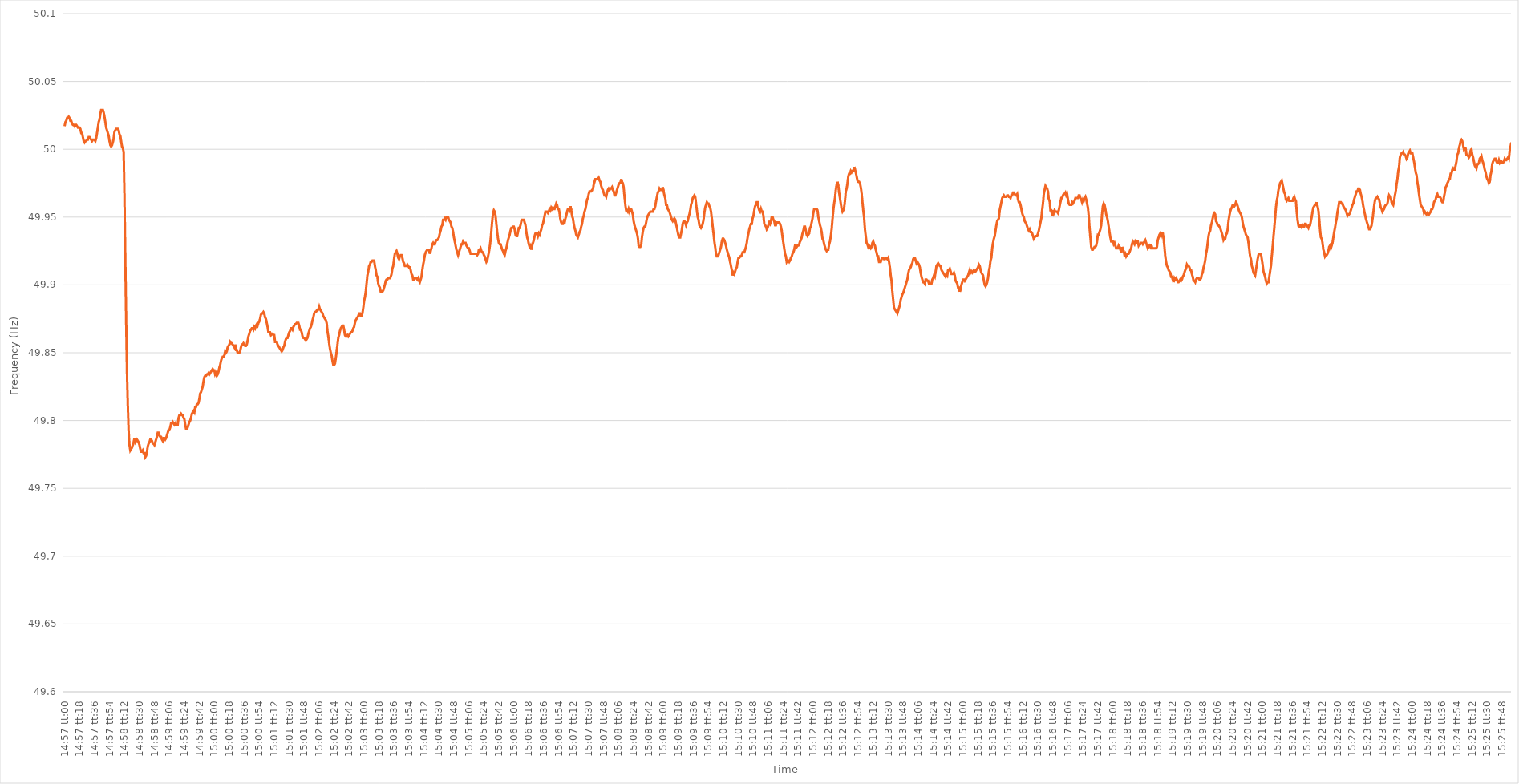
| Category | Series 0 |
|---|---|
| 0.6229166666666667 | 50.017 |
| 0.6229282407407407 | 50.02 |
| 0.6229398148148148 | 50.021 |
| 0.6229513888888889 | 50.023 |
| 0.6229629629629629 | 50.023 |
| 0.6229745370370371 | 50.024 |
| 0.6229861111111111 | 50.023 |
| 0.6229976851851852 | 50.021 |
| 0.6230092592592592 | 50.021 |
| 0.6230208333333334 | 50.019 |
| 0.6230324074074074 | 50.018 |
| 0.6230439814814815 | 50.018 |
| 0.6230555555555556 | 50.017 |
| 0.6230671296296296 | 50.018 |
| 0.6230787037037037 | 50.018 |
| 0.6230902777777778 | 50.017 |
| 0.6231018518518519 | 50.016 |
| 0.6231134259259259 | 50.016 |
| 0.623125 | 50.016 |
| 0.6231365740740741 | 50.015 |
| 0.6231481481481481 | 50.012 |
| 0.6231597222222222 | 50.012 |
| 0.6231712962962963 | 50.009 |
| 0.6231828703703703 | 50.006 |
| 0.6231944444444445 | 50.005 |
| 0.6232060185185185 | 50.006 |
| 0.6232175925925926 | 50.006 |
| 0.6232291666666666 | 50.007 |
| 0.6232407407407408 | 50.007 |
| 0.6232523148148148 | 50.009 |
| 0.623263888888889 | 50.009 |
| 0.623275462962963 | 50.008 |
| 0.623287037037037 | 50.007 |
| 0.6232986111111111 | 50.006 |
| 0.6233101851851852 | 50.007 |
| 0.6233217592592593 | 50.007 |
| 0.6233333333333334 | 50.007 |
| 0.6233449074074074 | 50.006 |
| 0.6233564814814815 | 50.008 |
| 0.6233680555555555 | 50.012 |
| 0.6233796296296296 | 50.016 |
| 0.6233912037037037 | 50.02 |
| 0.6234027777777778 | 50.022 |
| 0.6234143518518519 | 50.026 |
| 0.6234259259259259 | 50.029 |
| 0.6234375 | 50.029 |
| 0.623449074074074 | 50.029 |
| 0.6234606481481482 | 50.027 |
| 0.6234722222222222 | 50.024 |
| 0.6234837962962964 | 50.02 |
| 0.6234953703703704 | 50.016 |
| 0.6235069444444444 | 50.014 |
| 0.6235185185185185 | 50.012 |
| 0.6235300925925926 | 50.01 |
| 0.6235416666666667 | 50.006 |
| 0.6235532407407408 | 50.003 |
| 0.6235648148148148 | 50.002 |
| 0.6235763888888889 | 50.003 |
| 0.6235879629629629 | 50.005 |
| 0.623599537037037 | 50.008 |
| 0.6236111111111111 | 50.013 |
| 0.6236226851851852 | 50.014 |
| 0.6236342592592593 | 50.015 |
| 0.6236458333333333 | 50.015 |
| 0.6236574074074074 | 50.015 |
| 0.6236689814814814 | 50.014 |
| 0.6236805555555556 | 50.011 |
| 0.6236921296296296 | 50.01 |
| 0.6237037037037038 | 50.006 |
| 0.6237152777777778 | 50.002 |
| 0.6237268518518518 | 50.001 |
| 0.6237384259259259 | 49.998 |
| 0.62375 | 49.965 |
| 0.6237615740740741 | 49.919 |
| 0.6237731481481482 | 49.874 |
| 0.6237847222222223 | 49.836 |
| 0.6237962962962963 | 49.811 |
| 0.6238078703703703 | 49.792 |
| 0.6238194444444444 | 49.782 |
| 0.6238310185185185 | 49.778 |
| 0.6238425925925926 | 49.779 |
| 0.6238541666666667 | 49.78 |
| 0.6238657407407407 | 49.782 |
| 0.6238773148148148 | 49.784 |
| 0.6238888888888888 | 49.787 |
| 0.623900462962963 | 49.784 |
| 0.623912037037037 | 49.785 |
| 0.6239236111111112 | 49.786 |
| 0.6239351851851852 | 49.785 |
| 0.6239467592592592 | 49.784 |
| 0.6239583333333333 | 49.782 |
| 0.6239699074074074 | 49.779 |
| 0.6239814814814815 | 49.777 |
| 0.6239930555555556 | 49.777 |
| 0.6240046296296297 | 49.778 |
| 0.6240162037037037 | 49.776 |
| 0.6240277777777777 | 49.776 |
| 0.6240393518518519 | 49.773 |
| 0.6240509259259259 | 49.774 |
| 0.6240625 | 49.777 |
| 0.6240740740740741 | 49.781 |
| 0.6240856481481482 | 49.783 |
| 0.6240972222222222 | 49.784 |
| 0.6241087962962962 | 49.786 |
| 0.6241203703703704 | 49.786 |
| 0.6241319444444444 | 49.785 |
| 0.6241435185185186 | 49.783 |
| 0.6241550925925926 | 49.783 |
| 0.6241666666666666 | 49.782 |
| 0.6241782407407407 | 49.784 |
| 0.6241898148148148 | 49.786 |
| 0.6242013888888889 | 49.788 |
| 0.624212962962963 | 49.791 |
| 0.6242245370370371 | 49.791 |
| 0.6242361111111111 | 49.789 |
| 0.6242476851851851 | 49.788 |
| 0.6242592592592593 | 49.788 |
| 0.6242708333333333 | 49.786 |
| 0.6242824074074075 | 49.785 |
| 0.6242939814814815 | 49.787 |
| 0.6243055555555556 | 49.787 |
| 0.6243171296296296 | 49.786 |
| 0.6243287037037036 | 49.787 |
| 0.6243402777777778 | 49.789 |
| 0.6243518518518518 | 49.791 |
| 0.624363425925926 | 49.793 |
| 0.624375 | 49.793 |
| 0.624386574074074 | 49.795 |
| 0.6243981481481481 | 49.798 |
| 0.6244097222222222 | 49.798 |
| 0.6244212962962963 | 49.799 |
| 0.6244328703703704 | 49.798 |
| 0.6244444444444445 | 49.797 |
| 0.6244560185185185 | 49.798 |
| 0.6244675925925925 | 49.797 |
| 0.6244791666666667 | 49.797 |
| 0.6244907407407407 | 49.797 |
| 0.6245023148148149 | 49.802 |
| 0.6245138888888889 | 49.804 |
| 0.624525462962963 | 49.804 |
| 0.624537037037037 | 49.805 |
| 0.624548611111111 | 49.804 |
| 0.6245601851851852 | 49.804 |
| 0.6245717592592592 | 49.802 |
| 0.6245833333333334 | 49.801 |
| 0.6245949074074074 | 49.797 |
| 0.6246064814814815 | 49.794 |
| 0.6246180555555555 | 49.794 |
| 0.6246296296296296 | 49.795 |
| 0.6246412037037037 | 49.797 |
| 0.6246527777777778 | 49.799 |
| 0.6246643518518519 | 49.8 |
| 0.6246759259259259 | 49.802 |
| 0.6246875 | 49.805 |
| 0.6246990740740741 | 49.806 |
| 0.6247106481481481 | 49.807 |
| 0.6247222222222223 | 49.806 |
| 0.6247337962962963 | 49.81 |
| 0.6247453703703704 | 49.81 |
| 0.6247569444444444 | 49.812 |
| 0.6247685185185184 | 49.812 |
| 0.6247800925925926 | 49.813 |
| 0.6247916666666666 | 49.816 |
| 0.6248032407407408 | 49.82 |
| 0.6248148148148148 | 49.821 |
| 0.6248263888888889 | 49.823 |
| 0.6248379629629629 | 49.825 |
| 0.624849537037037 | 49.829 |
| 0.6248611111111111 | 49.832 |
| 0.6248726851851852 | 49.833 |
| 0.6248842592592593 | 49.833 |
| 0.6248958333333333 | 49.834 |
| 0.6249074074074074 | 49.834 |
| 0.6249189814814815 | 49.835 |
| 0.6249305555555555 | 49.834 |
| 0.6249421296296297 | 49.835 |
| 0.6249537037037037 | 49.836 |
| 0.6249652777777778 | 49.837 |
| 0.6249768518518518 | 49.838 |
| 0.624988425925926 | 49.837 |
| 0.625 | 49.837 |
| 0.625011574074074 | 49.834 |
| 0.6250231481481482 | 49.835 |
| 0.6250347222222222 | 49.833 |
| 0.6250462962962963 | 49.834 |
| 0.6250578703703703 | 49.836 |
| 0.6250694444444445 | 49.839 |
| 0.6250810185185185 | 49.841 |
| 0.6250925925925926 | 49.844 |
| 0.6251041666666667 | 49.846 |
| 0.6251157407407407 | 49.847 |
| 0.6251273148148148 | 49.847 |
| 0.6251388888888889 | 49.848 |
| 0.625150462962963 | 49.851 |
| 0.6251620370370371 | 49.85 |
| 0.6251736111111111 | 49.851 |
| 0.6251851851851852 | 49.854 |
| 0.6251967592592592 | 49.855 |
| 0.6252083333333334 | 49.856 |
| 0.6252199074074074 | 49.858 |
| 0.6252314814814816 | 49.857 |
| 0.6252430555555556 | 49.857 |
| 0.6252546296296296 | 49.856 |
| 0.6252662037037037 | 49.855 |
| 0.6252777777777777 | 49.854 |
| 0.6252893518518519 | 49.856 |
| 0.6253009259259259 | 49.852 |
| 0.6253125 | 49.852 |
| 0.6253240740740741 | 49.85 |
| 0.6253356481481481 | 49.85 |
| 0.6253472222222222 | 49.85 |
| 0.6253587962962963 | 49.851 |
| 0.6253703703703704 | 49.854 |
| 0.6253819444444445 | 49.856 |
| 0.6253935185185185 | 49.856 |
| 0.6254050925925926 | 49.857 |
| 0.6254166666666666 | 49.856 |
| 0.6254282407407408 | 49.855 |
| 0.6254398148148148 | 49.855 |
| 0.625451388888889 | 49.856 |
| 0.625462962962963 | 49.859 |
| 0.625474537037037 | 49.862 |
| 0.6254861111111111 | 49.864 |
| 0.6254976851851851 | 49.866 |
| 0.6255092592592593 | 49.867 |
| 0.6255208333333333 | 49.868 |
| 0.6255324074074075 | 49.868 |
| 0.6255439814814815 | 49.867 |
| 0.6255555555555555 | 49.869 |
| 0.6255671296296296 | 49.868 |
| 0.6255787037037037 | 49.87 |
| 0.6255902777777778 | 49.871 |
| 0.6256018518518519 | 49.87 |
| 0.625613425925926 | 49.872 |
| 0.625625 | 49.873 |
| 0.625636574074074 | 49.875 |
| 0.6256481481481482 | 49.878 |
| 0.6256597222222222 | 49.879 |
| 0.6256712962962964 | 49.879 |
| 0.6256828703703704 | 49.88 |
| 0.6256944444444444 | 49.879 |
| 0.6257060185185185 | 49.876 |
| 0.6257175925925925 | 49.875 |
| 0.6257291666666667 | 49.872 |
| 0.6257407407407407 | 49.869 |
| 0.6257523148148149 | 49.865 |
| 0.6257638888888889 | 49.865 |
| 0.6257754629629629 | 49.865 |
| 0.625787037037037 | 49.863 |
| 0.6257986111111111 | 49.864 |
| 0.6258101851851852 | 49.864 |
| 0.6258217592592593 | 49.863 |
| 0.6258333333333334 | 49.863 |
| 0.6258449074074074 | 49.858 |
| 0.6258564814814814 | 49.858 |
| 0.6258680555555556 | 49.858 |
| 0.6258796296296296 | 49.856 |
| 0.6258912037037038 | 49.855 |
| 0.6259027777777778 | 49.854 |
| 0.6259143518518518 | 49.853 |
| 0.6259259259259259 | 49.852 |
| 0.6259375 | 49.851 |
| 0.6259490740740741 | 49.852 |
| 0.6259606481481481 | 49.854 |
| 0.6259722222222223 | 49.855 |
| 0.6259837962962963 | 49.858 |
| 0.6259953703703703 | 49.86 |
| 0.6260069444444444 | 49.861 |
| 0.6260185185185185 | 49.861 |
| 0.6260300925925926 | 49.863 |
| 0.6260416666666667 | 49.865 |
| 0.6260532407407408 | 49.866 |
| 0.6260648148148148 | 49.868 |
| 0.6260763888888888 | 49.868 |
| 0.626087962962963 | 49.867 |
| 0.626099537037037 | 49.869 |
| 0.6261111111111112 | 49.87 |
| 0.6261226851851852 | 49.871 |
| 0.6261342592592593 | 49.871 |
| 0.6261458333333333 | 49.872 |
| 0.6261574074074074 | 49.872 |
| 0.6261689814814815 | 49.872 |
| 0.6261805555555556 | 49.87 |
| 0.6261921296296297 | 49.867 |
| 0.6262037037037037 | 49.867 |
| 0.6262152777777777 | 49.865 |
| 0.6262268518518518 | 49.862 |
| 0.6262384259259259 | 49.861 |
| 0.62625 | 49.861 |
| 0.6262615740740741 | 49.86 |
| 0.6262731481481482 | 49.859 |
| 0.6262847222222222 | 49.86 |
| 0.6262962962962962 | 49.861 |
| 0.6263078703703704 | 49.864 |
| 0.6263194444444444 | 49.866 |
| 0.6263310185185186 | 49.868 |
| 0.6263425925925926 | 49.869 |
| 0.6263541666666667 | 49.871 |
| 0.6263657407407407 | 49.874 |
| 0.6263773148148148 | 49.876 |
| 0.6263888888888889 | 49.879 |
| 0.626400462962963 | 49.88 |
| 0.6264120370370371 | 49.88 |
| 0.6264236111111111 | 49.881 |
| 0.6264351851851852 | 49.881 |
| 0.6264467592592592 | 49.882 |
| 0.6264583333333333 | 49.884 |
| 0.6264699074074074 | 49.882 |
| 0.6264814814814815 | 49.881 |
| 0.6264930555555556 | 49.88 |
| 0.6265046296296296 | 49.879 |
| 0.6265162037037036 | 49.877 |
| 0.6265277777777778 | 49.876 |
| 0.6265393518518518 | 49.875 |
| 0.626550925925926 | 49.874 |
| 0.6265625 | 49.872 |
| 0.6265740740740741 | 49.866 |
| 0.6265856481481481 | 49.862 |
| 0.6265972222222222 | 49.857 |
| 0.6266087962962963 | 49.853 |
| 0.6266203703703704 | 49.85 |
| 0.6266319444444445 | 49.848 |
| 0.6266435185185185 | 49.844 |
| 0.6266550925925926 | 49.841 |
| 0.6266666666666666 | 49.841 |
| 0.6266782407407407 | 49.842 |
| 0.6266898148148148 | 49.846 |
| 0.6267013888888889 | 49.851 |
| 0.626712962962963 | 49.856 |
| 0.626724537037037 | 49.861 |
| 0.626736111111111 | 49.863 |
| 0.6267476851851852 | 49.866 |
| 0.6267592592592592 | 49.868 |
| 0.6267708333333334 | 49.869 |
| 0.6267824074074074 | 49.87 |
| 0.6267939814814815 | 49.87 |
| 0.6268055555555555 | 49.867 |
| 0.6268171296296297 | 49.863 |
| 0.6268287037037037 | 49.862 |
| 0.6268402777777778 | 49.862 |
| 0.6268518518518519 | 49.863 |
| 0.6268634259259259 | 49.862 |
| 0.626875 | 49.863 |
| 0.6268865740740741 | 49.864 |
| 0.6268981481481481 | 49.865 |
| 0.6269097222222222 | 49.865 |
| 0.6269212962962963 | 49.866 |
| 0.6269328703703704 | 49.868 |
| 0.6269444444444444 | 49.869 |
| 0.6269560185185185 | 49.872 |
| 0.6269675925925926 | 49.874 |
| 0.6269791666666666 | 49.875 |
| 0.6269907407407408 | 49.876 |
| 0.6270023148148148 | 49.877 |
| 0.6270138888888889 | 49.879 |
| 0.6270254629629629 | 49.879 |
| 0.6270370370370371 | 49.877 |
| 0.6270486111111111 | 49.877 |
| 0.6270601851851852 | 49.879 |
| 0.6270717592592593 | 49.883 |
| 0.6270833333333333 | 49.888 |
| 0.6270949074074074 | 49.891 |
| 0.6271064814814815 | 49.895 |
| 0.6271180555555556 | 49.901 |
| 0.6271296296296297 | 49.907 |
| 0.6271412037037037 | 49.91 |
| 0.6271527777777778 | 49.914 |
| 0.6271643518518518 | 49.915 |
| 0.6271759259259259 | 49.917 |
| 0.6271875 | 49.917 |
| 0.627199074074074 | 49.918 |
| 0.6272106481481482 | 49.918 |
| 0.6272222222222222 | 49.918 |
| 0.6272337962962963 | 49.914 |
| 0.6272453703703703 | 49.911 |
| 0.6272569444444445 | 49.907 |
| 0.6272685185185185 | 49.906 |
| 0.6272800925925927 | 49.901 |
| 0.6272916666666667 | 49.899 |
| 0.6273032407407407 | 49.898 |
| 0.6273148148148148 | 49.895 |
| 0.6273263888888889 | 49.895 |
| 0.627337962962963 | 49.895 |
| 0.6273495370370371 | 49.896 |
| 0.6273611111111111 | 49.898 |
| 0.6273726851851852 | 49.9 |
| 0.6273842592592592 | 49.903 |
| 0.6273958333333333 | 49.904 |
| 0.6274074074074074 | 49.904 |
| 0.6274189814814815 | 49.905 |
| 0.6274305555555556 | 49.905 |
| 0.6274421296296296 | 49.905 |
| 0.6274537037037037 | 49.906 |
| 0.6274652777777777 | 49.908 |
| 0.6274768518518519 | 49.912 |
| 0.6274884259259259 | 49.914 |
| 0.6275000000000001 | 49.919 |
| 0.6275115740740741 | 49.923 |
| 0.6275231481481481 | 49.924 |
| 0.6275347222222222 | 49.925 |
| 0.6275462962962963 | 49.923 |
| 0.6275578703703704 | 49.92 |
| 0.6275694444444445 | 49.919 |
| 0.6275810185185186 | 49.921 |
| 0.6275925925925926 | 49.922 |
| 0.6276041666666666 | 49.922 |
| 0.6276157407407407 | 49.92 |
| 0.6276273148148148 | 49.917 |
| 0.6276388888888889 | 49.916 |
| 0.627650462962963 | 49.914 |
| 0.627662037037037 | 49.914 |
| 0.6276736111111111 | 49.914 |
| 0.6276851851851851 | 49.915 |
| 0.6276967592592593 | 49.914 |
| 0.6277083333333333 | 49.913 |
| 0.6277199074074075 | 49.913 |
| 0.6277314814814815 | 49.911 |
| 0.6277430555555555 | 49.908 |
| 0.6277546296296296 | 49.907 |
| 0.6277662037037037 | 49.904 |
| 0.6277777777777778 | 49.904 |
| 0.6277893518518519 | 49.905 |
| 0.627800925925926 | 49.905 |
| 0.6278125 | 49.905 |
| 0.627824074074074 | 49.904 |
| 0.6278356481481482 | 49.905 |
| 0.6278472222222222 | 49.903 |
| 0.6278587962962963 | 49.902 |
| 0.6278703703703704 | 49.904 |
| 0.6278819444444445 | 49.906 |
| 0.6278935185185185 | 49.911 |
| 0.6279050925925925 | 49.915 |
| 0.6279166666666667 | 49.918 |
| 0.6279282407407407 | 49.922 |
| 0.6279398148148149 | 49.924 |
| 0.6279513888888889 | 49.925 |
| 0.627962962962963 | 49.926 |
| 0.627974537037037 | 49.926 |
| 0.6279861111111111 | 49.926 |
| 0.6279976851851852 | 49.923 |
| 0.6280092592592593 | 49.925 |
| 0.6280208333333334 | 49.927 |
| 0.6280324074074074 | 49.93 |
| 0.6280439814814814 | 49.931 |
| 0.6280555555555556 | 49.93 |
| 0.6280671296296296 | 49.93 |
| 0.6280787037037037 | 49.932 |
| 0.6280902777777778 | 49.933 |
| 0.6281018518518519 | 49.933 |
| 0.6281134259259259 | 49.934 |
| 0.6281249999999999 | 49.935 |
| 0.6281365740740741 | 49.938 |
| 0.6281481481481481 | 49.94 |
| 0.6281597222222223 | 49.943 |
| 0.6281712962962963 | 49.944 |
| 0.6281828703703703 | 49.948 |
| 0.6281944444444444 | 49.948 |
| 0.6282060185185185 | 49.949 |
| 0.6282175925925926 | 49.948 |
| 0.6282291666666667 | 49.95 |
| 0.6282407407407408 | 49.95 |
| 0.6282523148148148 | 49.95 |
| 0.6282638888888888 | 49.948 |
| 0.628275462962963 | 49.947 |
| 0.628287037037037 | 49.946 |
| 0.6282986111111112 | 49.943 |
| 0.6283101851851852 | 49.942 |
| 0.6283217592592593 | 49.939 |
| 0.6283333333333333 | 49.935 |
| 0.6283449074074073 | 49.932 |
| 0.6283564814814815 | 49.929 |
| 0.6283680555555555 | 49.926 |
| 0.6283796296296297 | 49.924 |
| 0.6283912037037037 | 49.922 |
| 0.6284027777777778 | 49.924 |
| 0.6284143518518518 | 49.926 |
| 0.6284259259259259 | 49.928 |
| 0.6284375 | 49.93 |
| 0.6284490740740741 | 49.93 |
| 0.6284606481481482 | 49.932 |
| 0.6284722222222222 | 49.931 |
| 0.6284837962962962 | 49.931 |
| 0.6284953703703704 | 49.931 |
| 0.6285069444444444 | 49.929 |
| 0.6285185185185186 | 49.928 |
| 0.6285300925925926 | 49.927 |
| 0.6285416666666667 | 49.927 |
| 0.6285532407407407 | 49.925 |
| 0.6285648148148147 | 49.923 |
| 0.6285763888888889 | 49.923 |
| 0.6285879629629629 | 49.923 |
| 0.6285995370370371 | 49.923 |
| 0.6286111111111111 | 49.923 |
| 0.6286226851851852 | 49.923 |
| 0.6286342592592592 | 49.923 |
| 0.6286458333333333 | 49.923 |
| 0.6286574074074074 | 49.922 |
| 0.6286689814814815 | 49.923 |
| 0.6286805555555556 | 49.926 |
| 0.6286921296296296 | 49.926 |
| 0.6287037037037037 | 49.927 |
| 0.6287152777777778 | 49.925 |
| 0.6287268518518518 | 49.924 |
| 0.628738425925926 | 49.924 |
| 0.62875 | 49.922 |
| 0.6287615740740741 | 49.921 |
| 0.6287731481481481 | 49.919 |
| 0.6287847222222223 | 49.917 |
| 0.6287962962962963 | 49.918 |
| 0.6288078703703703 | 49.921 |
| 0.6288194444444445 | 49.924 |
| 0.6288310185185185 | 49.928 |
| 0.6288425925925926 | 49.933 |
| 0.6288541666666666 | 49.94 |
| 0.6288657407407408 | 49.947 |
| 0.6288773148148148 | 49.953 |
| 0.6288888888888889 | 49.955 |
| 0.628900462962963 | 49.954 |
| 0.628912037037037 | 49.951 |
| 0.6289236111111111 | 49.945 |
| 0.6289351851851852 | 49.939 |
| 0.6289467592592592 | 49.934 |
| 0.6289583333333334 | 49.931 |
| 0.6289699074074074 | 49.93 |
| 0.6289814814814815 | 49.93 |
| 0.6289930555555555 | 49.928 |
| 0.6290046296296297 | 49.926 |
| 0.6290162037037037 | 49.925 |
| 0.6290277777777777 | 49.923 |
| 0.6290393518518519 | 49.922 |
| 0.6290509259259259 | 49.925 |
| 0.6290625 | 49.927 |
| 0.629074074074074 | 49.93 |
| 0.6290856481481482 | 49.933 |
| 0.6290972222222222 | 49.935 |
| 0.6291087962962963 | 49.937 |
| 0.6291203703703704 | 49.94 |
| 0.6291319444444444 | 49.942 |
| 0.6291435185185185 | 49.942 |
| 0.6291550925925926 | 49.943 |
| 0.6291666666666667 | 49.943 |
| 0.6291782407407408 | 49.941 |
| 0.6291898148148148 | 49.937 |
| 0.6292013888888889 | 49.936 |
| 0.6292129629629629 | 49.936 |
| 0.6292245370370371 | 49.939 |
| 0.6292361111111111 | 49.942 |
| 0.6292476851851853 | 49.942 |
| 0.6292592592592593 | 49.944 |
| 0.6292708333333333 | 49.947 |
| 0.6292824074074074 | 49.948 |
| 0.6292939814814814 | 49.948 |
| 0.6293055555555556 | 49.948 |
| 0.6293171296296296 | 49.946 |
| 0.6293287037037038 | 49.944 |
| 0.6293402777777778 | 49.939 |
| 0.6293518518518518 | 49.935 |
| 0.6293634259259259 | 49.933 |
| 0.629375 | 49.93 |
| 0.6293865740740741 | 49.928 |
| 0.6293981481481482 | 49.929 |
| 0.6294097222222222 | 49.926 |
| 0.6294212962962963 | 49.929 |
| 0.6294328703703703 | 49.931 |
| 0.6294444444444445 | 49.933 |
| 0.6294560185185185 | 49.936 |
| 0.6294675925925927 | 49.938 |
| 0.6294791666666667 | 49.938 |
| 0.6294907407407407 | 49.938 |
| 0.6295023148148148 | 49.936 |
| 0.6295138888888888 | 49.938 |
| 0.629525462962963 | 49.937 |
| 0.629537037037037 | 49.939 |
| 0.6295486111111112 | 49.941 |
| 0.6295601851851852 | 49.944 |
| 0.6295717592592592 | 49.945 |
| 0.6295833333333333 | 49.948 |
| 0.6295949074074074 | 49.951 |
| 0.6296064814814815 | 49.954 |
| 0.6296180555555556 | 49.954 |
| 0.6296296296296297 | 49.954 |
| 0.6296412037037037 | 49.953 |
| 0.6296527777777777 | 49.954 |
| 0.6296643518518519 | 49.956 |
| 0.6296759259259259 | 49.955 |
| 0.6296875000000001 | 49.957 |
| 0.6296990740740741 | 49.956 |
| 0.6297106481481481 | 49.957 |
| 0.6297222222222222 | 49.956 |
| 0.6297337962962963 | 49.956 |
| 0.6297453703703704 | 49.958 |
| 0.6297569444444444 | 49.96 |
| 0.6297685185185186 | 49.959 |
| 0.6297800925925926 | 49.956 |
| 0.6297916666666666 | 49.956 |
| 0.6298032407407407 | 49.953 |
| 0.6298148148148148 | 49.948 |
| 0.6298263888888889 | 49.946 |
| 0.629837962962963 | 49.945 |
| 0.629849537037037 | 49.945 |
| 0.6298611111111111 | 49.947 |
| 0.6298726851851851 | 49.946 |
| 0.6298842592592593 | 49.949 |
| 0.6298958333333333 | 49.951 |
| 0.6299074074074075 | 49.954 |
| 0.6299189814814815 | 49.956 |
| 0.6299305555555555 | 49.956 |
| 0.6299421296296296 | 49.955 |
| 0.6299537037037037 | 49.958 |
| 0.6299652777777778 | 49.955 |
| 0.6299768518518518 | 49.951 |
| 0.629988425925926 | 49.949 |
| 0.63 | 49.945 |
| 0.630011574074074 | 49.942 |
| 0.6300231481481481 | 49.94 |
| 0.6300347222222222 | 49.937 |
| 0.6300462962962963 | 49.936 |
| 0.6300578703703704 | 49.935 |
| 0.6300694444444445 | 49.937 |
| 0.6300810185185185 | 49.939 |
| 0.6300925925925925 | 49.94 |
| 0.6301041666666667 | 49.943 |
| 0.6301157407407407 | 49.945 |
| 0.6301273148148149 | 49.949 |
| 0.6301388888888889 | 49.951 |
| 0.630150462962963 | 49.954 |
| 0.630162037037037 | 49.956 |
| 0.6301736111111111 | 49.959 |
| 0.6301851851851852 | 49.963 |
| 0.6301967592592593 | 49.964 |
| 0.6302083333333334 | 49.967 |
| 0.6302199074074074 | 49.969 |
| 0.6302314814814814 | 49.969 |
| 0.6302430555555555 | 49.969 |
| 0.6302546296296296 | 49.97 |
| 0.6302662037037037 | 49.97 |
| 0.6302777777777778 | 49.974 |
| 0.6302893518518519 | 49.976 |
| 0.6303009259259259 | 49.978 |
| 0.6303124999999999 | 49.978 |
| 0.6303240740740741 | 49.978 |
| 0.6303356481481481 | 49.978 |
| 0.6303472222222223 | 49.979 |
| 0.6303587962962963 | 49.977 |
| 0.6303703703703704 | 49.976 |
| 0.6303819444444444 | 49.973 |
| 0.6303935185185185 | 49.971 |
| 0.6304050925925926 | 49.97 |
| 0.6304166666666667 | 49.968 |
| 0.6304282407407408 | 49.966 |
| 0.6304398148148148 | 49.966 |
| 0.6304513888888889 | 49.965 |
| 0.6304629629629629 | 49.968 |
| 0.630474537037037 | 49.97 |
| 0.6304861111111111 | 49.971 |
| 0.6304976851851852 | 49.97 |
| 0.6305092592592593 | 49.971 |
| 0.6305208333333333 | 49.971 |
| 0.6305324074074073 | 49.972 |
| 0.6305439814814815 | 49.97 |
| 0.6305555555555555 | 49.969 |
| 0.6305671296296297 | 49.966 |
| 0.6305787037037037 | 49.966 |
| 0.6305902777777778 | 49.968 |
| 0.6306018518518518 | 49.97 |
| 0.630613425925926 | 49.972 |
| 0.630625 | 49.974 |
| 0.6306365740740741 | 49.975 |
| 0.6306481481481482 | 49.975 |
| 0.6306597222222222 | 49.978 |
| 0.6306712962962963 | 49.976 |
| 0.6306828703703703 | 49.975 |
| 0.6306944444444444 | 49.972 |
| 0.6307060185185185 | 49.965 |
| 0.6307175925925926 | 49.959 |
| 0.6307291666666667 | 49.955 |
| 0.6307407407407407 | 49.955 |
| 0.6307523148148148 | 49.954 |
| 0.6307638888888889 | 49.956 |
| 0.6307754629629629 | 49.954 |
| 0.6307870370370371 | 49.956 |
| 0.6307986111111111 | 49.956 |
| 0.6308101851851852 | 49.954 |
| 0.6308217592592592 | 49.952 |
| 0.6308333333333334 | 49.947 |
| 0.6308449074074074 | 49.944 |
| 0.6308564814814815 | 49.942 |
| 0.6308680555555556 | 49.94 |
| 0.6308796296296296 | 49.938 |
| 0.6308912037037037 | 49.935 |
| 0.6309027777777778 | 49.929 |
| 0.6309143518518519 | 49.928 |
| 0.6309259259259259 | 49.928 |
| 0.6309375 | 49.929 |
| 0.6309490740740741 | 49.935 |
| 0.6309606481481481 | 49.939 |
| 0.6309722222222222 | 49.942 |
| 0.6309837962962963 | 49.943 |
| 0.6309953703703703 | 49.943 |
| 0.6310069444444445 | 49.946 |
| 0.6310185185185185 | 49.949 |
| 0.6310300925925926 | 49.951 |
| 0.6310416666666666 | 49.952 |
| 0.6310532407407408 | 49.953 |
| 0.6310648148148148 | 49.954 |
| 0.631076388888889 | 49.954 |
| 0.631087962962963 | 49.954 |
| 0.631099537037037 | 49.954 |
| 0.6311111111111111 | 49.956 |
| 0.6311226851851852 | 49.956 |
| 0.6311342592592593 | 49.958 |
| 0.6311458333333334 | 49.962 |
| 0.6311574074074074 | 49.965 |
| 0.6311689814814815 | 49.968 |
| 0.6311805555555555 | 49.969 |
| 0.6311921296296296 | 49.971 |
| 0.6312037037037037 | 49.97 |
| 0.6312152777777778 | 49.97 |
| 0.6312268518518519 | 49.97 |
| 0.6312384259259259 | 49.972 |
| 0.63125 | 49.969 |
| 0.631261574074074 | 49.966 |
| 0.6312731481481482 | 49.964 |
| 0.6312847222222222 | 49.959 |
| 0.6312962962962964 | 49.959 |
| 0.6313078703703704 | 49.956 |
| 0.6313194444444444 | 49.955 |
| 0.6313310185185185 | 49.954 |
| 0.6313425925925926 | 49.952 |
| 0.6313541666666667 | 49.95 |
| 0.6313657407407408 | 49.948 |
| 0.6313773148148148 | 49.947 |
| 0.6313888888888889 | 49.948 |
| 0.6314004629629629 | 49.949 |
| 0.631412037037037 | 49.948 |
| 0.6314236111111111 | 49.945 |
| 0.6314351851851852 | 49.942 |
| 0.6314467592592593 | 49.939 |
| 0.6314583333333333 | 49.936 |
| 0.6314699074074074 | 49.935 |
| 0.6314814814814814 | 49.935 |
| 0.6314930555555556 | 49.938 |
| 0.6315046296296296 | 49.941 |
| 0.6315162037037038 | 49.945 |
| 0.6315277777777778 | 49.947 |
| 0.6315393518518518 | 49.947 |
| 0.6315509259259259 | 49.946 |
| 0.6315625 | 49.944 |
| 0.6315740740740741 | 49.946 |
| 0.6315856481481482 | 49.947 |
| 0.6315972222222223 | 49.95 |
| 0.6316087962962963 | 49.952 |
| 0.6316203703703703 | 49.955 |
| 0.6316319444444445 | 49.959 |
| 0.6316435185185185 | 49.961 |
| 0.6316550925925926 | 49.964 |
| 0.6316666666666667 | 49.965 |
| 0.6316782407407407 | 49.966 |
| 0.6316898148148148 | 49.965 |
| 0.6317013888888888 | 49.96 |
| 0.631712962962963 | 49.955 |
| 0.631724537037037 | 49.95 |
| 0.6317361111111112 | 49.948 |
| 0.6317476851851852 | 49.944 |
| 0.6317592592592592 | 49.943 |
| 0.6317708333333333 | 49.942 |
| 0.6317824074074074 | 49.943 |
| 0.6317939814814815 | 49.945 |
| 0.6318055555555556 | 49.948 |
| 0.6318171296296297 | 49.953 |
| 0.6318287037037037 | 49.957 |
| 0.6318402777777777 | 49.959 |
| 0.6318518518518519 | 49.961 |
| 0.6318634259259259 | 49.96 |
| 0.631875 | 49.96 |
| 0.6318865740740741 | 49.958 |
| 0.6318981481481482 | 49.957 |
| 0.6319097222222222 | 49.954 |
| 0.6319212962962962 | 49.949 |
| 0.6319328703703704 | 49.943 |
| 0.6319444444444444 | 49.938 |
| 0.6319560185185186 | 49.932 |
| 0.6319675925925926 | 49.928 |
| 0.6319791666666666 | 49.923 |
| 0.6319907407407407 | 49.921 |
| 0.6320023148148148 | 49.921 |
| 0.6320138888888889 | 49.922 |
| 0.632025462962963 | 49.924 |
| 0.6320370370370371 | 49.926 |
| 0.6320486111111111 | 49.928 |
| 0.6320601851851851 | 49.932 |
| 0.6320717592592593 | 49.934 |
| 0.6320833333333333 | 49.934 |
| 0.6320949074074075 | 49.933 |
| 0.6321064814814815 | 49.931 |
| 0.6321180555555556 | 49.929 |
| 0.6321296296296296 | 49.926 |
| 0.6321412037037036 | 49.924 |
| 0.6321527777777778 | 49.922 |
| 0.6321643518518518 | 49.92 |
| 0.632175925925926 | 49.917 |
| 0.6321875 | 49.914 |
| 0.632199074074074 | 49.911 |
| 0.6322106481481481 | 49.907 |
| 0.6322222222222222 | 49.909 |
| 0.6322337962962963 | 49.908 |
| 0.6322453703703704 | 49.91 |
| 0.6322569444444445 | 49.912 |
| 0.6322685185185185 | 49.913 |
| 0.6322800925925925 | 49.917 |
| 0.6322916666666667 | 49.92 |
| 0.6323032407407407 | 49.92 |
| 0.6323148148148149 | 49.921 |
| 0.6323263888888889 | 49.921 |
| 0.632337962962963 | 49.922 |
| 0.632349537037037 | 49.924 |
| 0.632361111111111 | 49.924 |
| 0.6323726851851852 | 49.924 |
| 0.6323842592592592 | 49.926 |
| 0.6323958333333334 | 49.928 |
| 0.6324074074074074 | 49.931 |
| 0.6324189814814815 | 49.935 |
| 0.6324305555555555 | 49.938 |
| 0.6324421296296296 | 49.941 |
| 0.6324537037037037 | 49.943 |
| 0.6324652777777778 | 49.945 |
| 0.6324768518518519 | 49.945 |
| 0.6324884259259259 | 49.949 |
| 0.6325 | 49.951 |
| 0.6325115740740741 | 49.955 |
| 0.6325231481481481 | 49.958 |
| 0.6325347222222223 | 49.959 |
| 0.6325462962962963 | 49.961 |
| 0.6325578703703704 | 49.961 |
| 0.6325694444444444 | 49.957 |
| 0.6325810185185184 | 49.955 |
| 0.6325925925925926 | 49.954 |
| 0.6326041666666666 | 49.956 |
| 0.6326157407407408 | 49.954 |
| 0.6326273148148148 | 49.954 |
| 0.6326388888888889 | 49.951 |
| 0.6326504629629629 | 49.945 |
| 0.632662037037037 | 49.944 |
| 0.6326736111111111 | 49.943 |
| 0.6326851851851852 | 49.941 |
| 0.6326967592592593 | 49.942 |
| 0.6327083333333333 | 49.944 |
| 0.6327199074074074 | 49.946 |
| 0.6327314814814815 | 49.945 |
| 0.6327430555555555 | 49.947 |
| 0.6327546296296297 | 49.95 |
| 0.6327662037037037 | 49.95 |
| 0.6327777777777778 | 49.948 |
| 0.6327893518518518 | 49.947 |
| 0.632800925925926 | 49.944 |
| 0.6328125 | 49.944 |
| 0.632824074074074 | 49.946 |
| 0.6328356481481482 | 49.946 |
| 0.6328472222222222 | 49.946 |
| 0.6328587962962963 | 49.946 |
| 0.6328703703703703 | 49.945 |
| 0.6328819444444445 | 49.943 |
| 0.6328935185185185 | 49.94 |
| 0.6329050925925926 | 49.935 |
| 0.6329166666666667 | 49.931 |
| 0.6329282407407407 | 49.927 |
| 0.6329398148148148 | 49.923 |
| 0.6329513888888889 | 49.921 |
| 0.632962962962963 | 49.917 |
| 0.6329745370370371 | 49.918 |
| 0.6329861111111111 | 49.918 |
| 0.6329976851851852 | 49.917 |
| 0.6330092592592592 | 49.918 |
| 0.6330208333333334 | 49.92 |
| 0.6330324074074074 | 49.921 |
| 0.6330439814814816 | 49.923 |
| 0.6330555555555556 | 49.924 |
| 0.6330671296296296 | 49.926 |
| 0.6330787037037037 | 49.929 |
| 0.6330902777777777 | 49.929 |
| 0.6331018518518519 | 49.928 |
| 0.6331134259259259 | 49.929 |
| 0.633125 | 49.929 |
| 0.6331365740740741 | 49.93 |
| 0.6331481481481481 | 49.932 |
| 0.6331597222222222 | 49.933 |
| 0.6331712962962963 | 49.935 |
| 0.6331828703703704 | 49.938 |
| 0.6331944444444445 | 49.94 |
| 0.6332060185185185 | 49.943 |
| 0.6332175925925926 | 49.943 |
| 0.6332291666666666 | 49.94 |
| 0.6332407407407408 | 49.937 |
| 0.6332523148148148 | 49.936 |
| 0.633263888888889 | 49.937 |
| 0.633275462962963 | 49.938 |
| 0.633287037037037 | 49.942 |
| 0.6332986111111111 | 49.943 |
| 0.6333101851851851 | 49.946 |
| 0.6333217592592593 | 49.949 |
| 0.6333333333333333 | 49.953 |
| 0.6333449074074075 | 49.956 |
| 0.6333564814814815 | 49.956 |
| 0.6333680555555555 | 49.956 |
| 0.6333796296296296 | 49.956 |
| 0.6333912037037037 | 49.955 |
| 0.6334027777777778 | 49.95 |
| 0.6334143518518519 | 49.947 |
| 0.633425925925926 | 49.944 |
| 0.6334375 | 49.942 |
| 0.633449074074074 | 49.939 |
| 0.6334606481481482 | 49.934 |
| 0.6334722222222222 | 49.933 |
| 0.6334837962962964 | 49.93 |
| 0.6334953703703704 | 49.928 |
| 0.6335069444444444 | 49.926 |
| 0.6335185185185185 | 49.925 |
| 0.6335300925925925 | 49.926 |
| 0.6335416666666667 | 49.926 |
| 0.6335532407407407 | 49.93 |
| 0.6335648148148149 | 49.932 |
| 0.6335763888888889 | 49.936 |
| 0.6335879629629629 | 49.941 |
| 0.633599537037037 | 49.948 |
| 0.6336111111111111 | 49.955 |
| 0.6336226851851852 | 49.96 |
| 0.6336342592592593 | 49.964 |
| 0.6336458333333334 | 49.97 |
| 0.6336574074074074 | 49.974 |
| 0.6336689814814814 | 49.976 |
| 0.6336805555555556 | 49.973 |
| 0.6336921296296296 | 49.968 |
| 0.6337037037037038 | 49.964 |
| 0.6337152777777778 | 49.96 |
| 0.6337268518518518 | 49.956 |
| 0.6337384259259259 | 49.954 |
| 0.63375 | 49.955 |
| 0.6337615740740741 | 49.957 |
| 0.6337731481481481 | 49.962 |
| 0.6337847222222223 | 49.969 |
| 0.6337962962962963 | 49.971 |
| 0.6338078703703703 | 49.975 |
| 0.6338194444444444 | 49.98 |
| 0.6338310185185185 | 49.982 |
| 0.6338425925925926 | 49.982 |
| 0.6338541666666667 | 49.984 |
| 0.6338657407407408 | 49.983 |
| 0.6338773148148148 | 49.984 |
| 0.6338888888888888 | 49.984 |
| 0.633900462962963 | 49.987 |
| 0.633912037037037 | 49.985 |
| 0.6339236111111112 | 49.983 |
| 0.6339351851851852 | 49.98 |
| 0.6339467592592593 | 49.977 |
| 0.6339583333333333 | 49.976 |
| 0.6339699074074074 | 49.976 |
| 0.6339814814814815 | 49.975 |
| 0.6339930555555555 | 49.972 |
| 0.6340046296296297 | 49.968 |
| 0.6340162037037037 | 49.961 |
| 0.6340277777777777 | 49.955 |
| 0.6340393518518518 | 49.95 |
| 0.6340509259259259 | 49.941 |
| 0.6340625 | 49.936 |
| 0.6340740740740741 | 49.931 |
| 0.6340856481481482 | 49.93 |
| 0.6340972222222222 | 49.928 |
| 0.6341087962962962 | 49.929 |
| 0.6341203703703704 | 49.928 |
| 0.6341319444444444 | 49.927 |
| 0.6341435185185186 | 49.928 |
| 0.6341550925925926 | 49.931 |
| 0.6341666666666667 | 49.932 |
| 0.6341782407407407 | 49.93 |
| 0.6341898148148148 | 49.929 |
| 0.6342013888888889 | 49.926 |
| 0.634212962962963 | 49.924 |
| 0.6342245370370371 | 49.921 |
| 0.6342361111111111 | 49.921 |
| 0.6342476851851852 | 49.917 |
| 0.6342592592592592 | 49.917 |
| 0.6342708333333333 | 49.917 |
| 0.6342824074074074 | 49.919 |
| 0.6342939814814815 | 49.92 |
| 0.6343055555555556 | 49.92 |
| 0.6343171296296296 | 49.919 |
| 0.6343287037037036 | 49.919 |
| 0.6343402777777778 | 49.92 |
| 0.6343518518518518 | 49.92 |
| 0.634363425925926 | 49.919 |
| 0.634375 | 49.92 |
| 0.6343865740740741 | 49.917 |
| 0.6343981481481481 | 49.913 |
| 0.6344097222222222 | 49.907 |
| 0.6344212962962963 | 49.903 |
| 0.6344328703703704 | 49.895 |
| 0.6344444444444445 | 49.889 |
| 0.6344560185185185 | 49.883 |
| 0.6344675925925926 | 49.882 |
| 0.6344791666666666 | 49.881 |
| 0.6344907407407407 | 49.88 |
| 0.6345023148148148 | 49.879 |
| 0.6345138888888889 | 49.881 |
| 0.634525462962963 | 49.883 |
| 0.634537037037037 | 49.885 |
| 0.634548611111111 | 49.889 |
| 0.6345601851851852 | 49.891 |
| 0.6345717592592592 | 49.893 |
| 0.6345833333333334 | 49.894 |
| 0.6345949074074074 | 49.896 |
| 0.6346064814814815 | 49.898 |
| 0.6346180555555555 | 49.9 |
| 0.6346296296296297 | 49.902 |
| 0.6346412037037037 | 49.904 |
| 0.6346527777777778 | 49.908 |
| 0.6346643518518519 | 49.911 |
| 0.6346759259259259 | 49.912 |
| 0.6346875 | 49.913 |
| 0.6346990740740741 | 49.915 |
| 0.6347106481481481 | 49.916 |
| 0.6347222222222222 | 49.919 |
| 0.6347337962962963 | 49.92 |
| 0.6347453703703704 | 49.92 |
| 0.6347569444444444 | 49.918 |
| 0.6347685185185185 | 49.916 |
| 0.6347800925925926 | 49.917 |
| 0.6347916666666666 | 49.916 |
| 0.6348032407407408 | 49.915 |
| 0.6348148148148148 | 49.913 |
| 0.6348263888888889 | 49.909 |
| 0.6348379629629629 | 49.906 |
| 0.6348495370370371 | 49.904 |
| 0.6348611111111111 | 49.902 |
| 0.6348726851851852 | 49.902 |
| 0.6348842592592593 | 49.901 |
| 0.6348958333333333 | 49.904 |
| 0.6349074074074074 | 49.904 |
| 0.6349189814814815 | 49.903 |
| 0.6349305555555556 | 49.903 |
| 0.6349421296296297 | 49.901 |
| 0.6349537037037037 | 49.901 |
| 0.6349652777777778 | 49.901 |
| 0.6349768518518518 | 49.901 |
| 0.6349884259259259 | 49.904 |
| 0.635 | 49.905 |
| 0.635011574074074 | 49.907 |
| 0.6350231481481482 | 49.906 |
| 0.6350347222222222 | 49.91 |
| 0.6350462962962963 | 49.914 |
| 0.6350578703703703 | 49.915 |
| 0.6350694444444445 | 49.916 |
| 0.6350810185185185 | 49.915 |
| 0.6350925925925927 | 49.914 |
| 0.6351041666666667 | 49.914 |
| 0.6351157407407407 | 49.911 |
| 0.6351273148148148 | 49.91 |
| 0.6351388888888889 | 49.909 |
| 0.635150462962963 | 49.908 |
| 0.6351620370370371 | 49.907 |
| 0.6351736111111111 | 49.906 |
| 0.6351851851851852 | 49.908 |
| 0.6351967592592592 | 49.907 |
| 0.6352083333333333 | 49.911 |
| 0.6352199074074074 | 49.911 |
| 0.6352314814814815 | 49.912 |
| 0.6352430555555556 | 49.91 |
| 0.6352546296296296 | 49.908 |
| 0.6352662037037037 | 49.908 |
| 0.6352777777777777 | 49.908 |
| 0.6352893518518519 | 49.909 |
| 0.6353009259259259 | 49.907 |
| 0.6353125000000001 | 49.903 |
| 0.6353240740740741 | 49.902 |
| 0.6353356481481481 | 49.901 |
| 0.6353472222222222 | 49.898 |
| 0.6353587962962963 | 49.898 |
| 0.6353703703703704 | 49.895 |
| 0.6353819444444445 | 49.897 |
| 0.6353935185185186 | 49.9 |
| 0.6354050925925926 | 49.902 |
| 0.6354166666666666 | 49.904 |
| 0.6354282407407407 | 49.904 |
| 0.6354398148148148 | 49.903 |
| 0.6354513888888889 | 49.904 |
| 0.635462962962963 | 49.905 |
| 0.635474537037037 | 49.906 |
| 0.6354861111111111 | 49.907 |
| 0.6354976851851851 | 49.909 |
| 0.6355092592592593 | 49.911 |
| 0.6355208333333333 | 49.909 |
| 0.6355324074074075 | 49.91 |
| 0.6355439814814815 | 49.909 |
| 0.6355555555555555 | 49.91 |
| 0.6355671296296296 | 49.911 |
| 0.6355787037037037 | 49.91 |
| 0.6355902777777778 | 49.91 |
| 0.6356018518518519 | 49.911 |
| 0.635613425925926 | 49.912 |
| 0.635625 | 49.913 |
| 0.635636574074074 | 49.915 |
| 0.6356481481481482 | 49.914 |
| 0.6356597222222222 | 49.911 |
| 0.6356712962962963 | 49.909 |
| 0.6356828703703704 | 49.908 |
| 0.6356944444444445 | 49.907 |
| 0.6357060185185185 | 49.903 |
| 0.6357175925925925 | 49.9 |
| 0.6357291666666667 | 49.899 |
| 0.6357407407407407 | 49.9 |
| 0.6357523148148149 | 49.902 |
| 0.6357638888888889 | 49.905 |
| 0.635775462962963 | 49.91 |
| 0.635787037037037 | 49.913 |
| 0.6357986111111111 | 49.918 |
| 0.6358101851851852 | 49.92 |
| 0.6358217592592593 | 49.927 |
| 0.6358333333333334 | 49.931 |
| 0.6358449074074074 | 49.934 |
| 0.6358564814814814 | 49.936 |
| 0.6358680555555556 | 49.94 |
| 0.6358796296296296 | 49.944 |
| 0.6358912037037037 | 49.947 |
| 0.6359027777777778 | 49.948 |
| 0.6359143518518519 | 49.949 |
| 0.6359259259259259 | 49.955 |
| 0.6359374999999999 | 49.958 |
| 0.6359490740740741 | 49.961 |
| 0.6359606481481481 | 49.964 |
| 0.6359722222222223 | 49.965 |
| 0.6359837962962963 | 49.966 |
| 0.6359953703703703 | 49.965 |
| 0.6360069444444444 | 49.965 |
| 0.6360185185185185 | 49.965 |
| 0.6360300925925926 | 49.966 |
| 0.6360416666666667 | 49.966 |
| 0.6360532407407408 | 49.965 |
| 0.6360648148148148 | 49.965 |
| 0.6360763888888888 | 49.964 |
| 0.636087962962963 | 49.966 |
| 0.636099537037037 | 49.966 |
| 0.6361111111111112 | 49.968 |
| 0.6361226851851852 | 49.968 |
| 0.6361342592592593 | 49.967 |
| 0.6361458333333333 | 49.966 |
| 0.6361574074074073 | 49.966 |
| 0.6361689814814815 | 49.967 |
| 0.6361805555555555 | 49.963 |
| 0.6361921296296297 | 49.961 |
| 0.6362037037037037 | 49.961 |
| 0.6362152777777778 | 49.959 |
| 0.6362268518518518 | 49.956 |
| 0.6362384259259259 | 49.953 |
| 0.63625 | 49.951 |
| 0.6362615740740741 | 49.95 |
| 0.6362731481481482 | 49.947 |
| 0.6362847222222222 | 49.946 |
| 0.6362962962962962 | 49.945 |
| 0.6363078703703704 | 49.943 |
| 0.6363194444444444 | 49.941 |
| 0.6363310185185186 | 49.94 |
| 0.6363425925925926 | 49.941 |
| 0.6363541666666667 | 49.939 |
| 0.6363657407407407 | 49.939 |
| 0.6363773148148147 | 49.938 |
| 0.6363888888888889 | 49.936 |
| 0.6364004629629629 | 49.934 |
| 0.6364120370370371 | 49.935 |
| 0.6364236111111111 | 49.936 |
| 0.6364351851851852 | 49.936 |
| 0.6364467592592592 | 49.936 |
| 0.6364583333333333 | 49.938 |
| 0.6364699074074074 | 49.94 |
| 0.6364814814814815 | 49.943 |
| 0.6364930555555556 | 49.946 |
| 0.6365046296296296 | 49.949 |
| 0.6365162037037037 | 49.955 |
| 0.6365277777777778 | 49.96 |
| 0.6365393518518518 | 49.967 |
| 0.636550925925926 | 49.97 |
| 0.6365625 | 49.973 |
| 0.6365740740740741 | 49.972 |
| 0.6365856481481481 | 49.971 |
| 0.6365972222222221 | 49.969 |
| 0.6366087962962963 | 49.963 |
| 0.6366203703703703 | 49.962 |
| 0.6366319444444445 | 49.955 |
| 0.6366435185185185 | 49.955 |
| 0.6366550925925926 | 49.951 |
| 0.6366666666666666 | 49.955 |
| 0.6366782407407408 | 49.953 |
| 0.6366898148148148 | 49.955 |
| 0.6367013888888889 | 49.954 |
| 0.636712962962963 | 49.954 |
| 0.636724537037037 | 49.954 |
| 0.6367361111111111 | 49.953 |
| 0.6367476851851852 | 49.955 |
| 0.6367592592592592 | 49.958 |
| 0.6367708333333334 | 49.961 |
| 0.6367824074074074 | 49.964 |
| 0.6367939814814815 | 49.964 |
| 0.6368055555555555 | 49.966 |
| 0.6368171296296297 | 49.967 |
| 0.6368287037037037 | 49.967 |
| 0.6368402777777779 | 49.968 |
| 0.6368518518518519 | 49.966 |
| 0.6368634259259259 | 49.967 |
| 0.636875 | 49.963 |
| 0.636886574074074 | 49.96 |
| 0.6368981481481482 | 49.959 |
| 0.6369097222222222 | 49.959 |
| 0.6369212962962963 | 49.959 |
| 0.6369328703703704 | 49.961 |
| 0.6369444444444444 | 49.96 |
| 0.6369560185185185 | 49.961 |
| 0.6369675925925926 | 49.962 |
| 0.6369791666666667 | 49.964 |
| 0.6369907407407408 | 49.964 |
| 0.6370023148148148 | 49.964 |
| 0.6370138888888889 | 49.964 |
| 0.6370254629629629 | 49.966 |
| 0.6370370370370371 | 49.966 |
| 0.6370486111111111 | 49.964 |
| 0.6370601851851853 | 49.963 |
| 0.6370717592592593 | 49.961 |
| 0.6370833333333333 | 49.963 |
| 0.6370949074074074 | 49.962 |
| 0.6371064814814814 | 49.964 |
| 0.6371180555555556 | 49.965 |
| 0.6371296296296296 | 49.963 |
| 0.6371412037037038 | 49.96 |
| 0.6371527777777778 | 49.957 |
| 0.6371643518518518 | 49.951 |
| 0.6371759259259259 | 49.942 |
| 0.6371875 | 49.935 |
| 0.6371990740740741 | 49.928 |
| 0.6372106481481482 | 49.926 |
| 0.6372222222222222 | 49.926 |
| 0.6372337962962963 | 49.927 |
| 0.6372453703703703 | 49.928 |
| 0.6372569444444445 | 49.928 |
| 0.6372685185185185 | 49.929 |
| 0.6372800925925927 | 49.932 |
| 0.6372916666666667 | 49.937 |
| 0.6373032407407407 | 49.937 |
| 0.6373148148148148 | 49.939 |
| 0.6373263888888888 | 49.941 |
| 0.637337962962963 | 49.944 |
| 0.637349537037037 | 49.952 |
| 0.6373611111111112 | 49.958 |
| 0.6373726851851852 | 49.96 |
| 0.6373842592592592 | 49.959 |
| 0.6373958333333333 | 49.956 |
| 0.6374074074074074 | 49.952 |
| 0.6374189814814815 | 49.95 |
| 0.6374305555555556 | 49.947 |
| 0.6374421296296297 | 49.943 |
| 0.6374537037037037 | 49.939 |
| 0.6374652777777777 | 49.935 |
| 0.6374768518518519 | 49.932 |
| 0.6374884259259259 | 49.932 |
| 0.6375000000000001 | 49.932 |
| 0.6375115740740741 | 49.93 |
| 0.6375231481481481 | 49.931 |
| 0.6375347222222222 | 49.929 |
| 0.6375462962962963 | 49.927 |
| 0.6375578703703704 | 49.927 |
| 0.6375694444444444 | 49.927 |
| 0.6375810185185186 | 49.929 |
| 0.6375925925925926 | 49.928 |
| 0.6376041666666666 | 49.926 |
| 0.6376157407407407 | 49.924 |
| 0.6376273148148148 | 49.928 |
| 0.6376388888888889 | 49.926 |
| 0.637650462962963 | 49.925 |
| 0.637662037037037 | 49.922 |
| 0.6376736111111111 | 49.923 |
| 0.6376851851851851 | 49.921 |
| 0.6376967592592593 | 49.922 |
| 0.6377083333333333 | 49.923 |
| 0.6377199074074075 | 49.923 |
| 0.6377314814814815 | 49.924 |
| 0.6377430555555555 | 49.926 |
| 0.6377546296296296 | 49.927 |
| 0.6377662037037037 | 49.93 |
| 0.6377777777777778 | 49.932 |
| 0.6377893518518518 | 49.931 |
| 0.637800925925926 | 49.93 |
| 0.6378125 | 49.932 |
| 0.637824074074074 | 49.931 |
| 0.6378356481481481 | 49.932 |
| 0.6378472222222222 | 49.932 |
| 0.6378587962962963 | 49.929 |
| 0.6378703703703704 | 49.93 |
| 0.6378819444444445 | 49.93 |
| 0.6378935185185185 | 49.931 |
| 0.6379050925925925 | 49.931 |
| 0.6379166666666667 | 49.93 |
| 0.6379282407407407 | 49.931 |
| 0.6379398148148149 | 49.932 |
| 0.6379513888888889 | 49.933 |
| 0.637962962962963 | 49.931 |
| 0.637974537037037 | 49.929 |
| 0.6379861111111111 | 49.927 |
| 0.6379976851851852 | 49.928 |
| 0.6380092592592593 | 49.929 |
| 0.6380208333333334 | 49.928 |
| 0.6380324074074074 | 49.93 |
| 0.6380439814814814 | 49.927 |
| 0.6380555555555555 | 49.927 |
| 0.6380671296296296 | 49.927 |
| 0.6380787037037037 | 49.927 |
| 0.6380902777777778 | 49.927 |
| 0.6381018518518519 | 49.927 |
| 0.6381134259259259 | 49.928 |
| 0.6381249999999999 | 49.933 |
| 0.6381365740740741 | 49.935 |
| 0.6381481481481481 | 49.937 |
| 0.6381597222222223 | 49.938 |
| 0.6381712962962963 | 49.936 |
| 0.6381828703703704 | 49.938 |
| 0.6381944444444444 | 49.938 |
| 0.6382060185185185 | 49.934 |
| 0.6382175925925926 | 49.928 |
| 0.6382291666666667 | 49.921 |
| 0.6382407407407408 | 49.917 |
| 0.6382523148148148 | 49.914 |
| 0.6382638888888889 | 49.913 |
| 0.6382754629629629 | 49.911 |
| 0.638287037037037 | 49.91 |
| 0.6382986111111111 | 49.909 |
| 0.6383101851851852 | 49.906 |
| 0.6383217592592593 | 49.906 |
| 0.6383333333333333 | 49.904 |
| 0.6383449074074073 | 49.902 |
| 0.6383564814814815 | 49.905 |
| 0.6383680555555555 | 49.904 |
| 0.6383796296296297 | 49.905 |
| 0.6383912037037037 | 49.904 |
| 0.6384027777777778 | 49.902 |
| 0.6384143518518518 | 49.902 |
| 0.638425925925926 | 49.903 |
| 0.6384375 | 49.904 |
| 0.6384490740740741 | 49.903 |
| 0.6384606481481482 | 49.904 |
| 0.6384722222222222 | 49.906 |
| 0.6384837962962963 | 49.907 |
| 0.6384953703703703 | 49.909 |
| 0.6385069444444444 | 49.911 |
| 0.6385185185185185 | 49.912 |
| 0.6385300925925926 | 49.915 |
| 0.6385416666666667 | 49.914 |
| 0.6385532407407407 | 49.914 |
| 0.6385648148148148 | 49.913 |
| 0.6385763888888889 | 49.911 |
| 0.6385879629629629 | 49.911 |
| 0.6385995370370371 | 49.908 |
| 0.6386111111111111 | 49.906 |
| 0.6386226851851852 | 49.903 |
| 0.6386342592592592 | 49.903 |
| 0.6386458333333334 | 49.902 |
| 0.6386574074074074 | 49.904 |
| 0.6386689814814815 | 49.905 |
| 0.6386805555555556 | 49.905 |
| 0.6386921296296296 | 49.905 |
| 0.6387037037037037 | 49.904 |
| 0.6387152777777778 | 49.904 |
| 0.6387268518518519 | 49.905 |
| 0.638738425925926 | 49.908 |
| 0.63875 | 49.909 |
| 0.6387615740740741 | 49.913 |
| 0.6387731481481481 | 49.915 |
| 0.6387847222222222 | 49.918 |
| 0.6387962962962963 | 49.923 |
| 0.6388078703703703 | 49.926 |
| 0.6388194444444445 | 49.931 |
| 0.6388310185185185 | 49.936 |
| 0.6388425925925926 | 49.939 |
| 0.6388541666666666 | 49.94 |
| 0.6388657407407408 | 49.944 |
| 0.6388773148148148 | 49.946 |
| 0.638888888888889 | 49.949 |
| 0.638900462962963 | 49.952 |
| 0.638912037037037 | 49.953 |
| 0.6389236111111111 | 49.952 |
| 0.6389351851851852 | 49.947 |
| 0.6389467592592593 | 49.946 |
| 0.6389583333333334 | 49.944 |
| 0.6389699074074074 | 49.944 |
| 0.6389814814814815 | 49.943 |
| 0.6389930555555555 | 49.942 |
| 0.6390046296296296 | 49.94 |
| 0.6390162037037037 | 49.938 |
| 0.6390277777777778 | 49.936 |
| 0.6390393518518519 | 49.933 |
| 0.6390509259259259 | 49.934 |
| 0.6390625 | 49.934 |
| 0.639074074074074 | 49.937 |
| 0.6390856481481482 | 49.938 |
| 0.6390972222222222 | 49.941 |
| 0.6391087962962964 | 49.947 |
| 0.6391203703703704 | 49.951 |
| 0.6391319444444444 | 49.954 |
| 0.6391435185185185 | 49.956 |
| 0.6391550925925926 | 49.957 |
| 0.6391666666666667 | 49.959 |
| 0.6391782407407408 | 49.959 |
| 0.6391898148148148 | 49.958 |
| 0.6392013888888889 | 49.959 |
| 0.6392129629629629 | 49.961 |
| 0.639224537037037 | 49.96 |
| 0.6392361111111111 | 49.958 |
| 0.6392476851851852 | 49.956 |
| 0.6392592592592593 | 49.954 |
| 0.6392708333333333 | 49.953 |
| 0.6392824074074074 | 49.952 |
| 0.6392939814814814 | 49.95 |
| 0.6393055555555556 | 49.946 |
| 0.6393171296296296 | 49.943 |
| 0.6393287037037038 | 49.941 |
| 0.6393402777777778 | 49.939 |
| 0.6393518518518518 | 49.937 |
| 0.6393634259259259 | 49.936 |
| 0.639375 | 49.935 |
| 0.6393865740740741 | 49.931 |
| 0.6393981481481482 | 49.926 |
| 0.6394097222222223 | 49.921 |
| 0.6394212962962963 | 49.919 |
| 0.6394328703703703 | 49.914 |
| 0.6394444444444445 | 49.912 |
| 0.6394560185185185 | 49.909 |
| 0.6394675925925926 | 49.908 |
| 0.6394791666666667 | 49.907 |
| 0.6394907407407407 | 49.911 |
| 0.6395023148148148 | 49.915 |
| 0.6395138888888888 | 49.919 |
| 0.639525462962963 | 49.922 |
| 0.639537037037037 | 49.923 |
| 0.6395486111111112 | 49.923 |
| 0.6395601851851852 | 49.923 |
| 0.6395717592592592 | 49.919 |
| 0.6395833333333333 | 49.915 |
| 0.6395949074074074 | 49.91 |
| 0.6396064814814815 | 49.908 |
| 0.6396180555555556 | 49.906 |
| 0.6396296296296297 | 49.903 |
| 0.6396412037037037 | 49.901 |
| 0.6396527777777777 | 49.902 |
| 0.6396643518518519 | 49.902 |
| 0.6396759259259259 | 49.906 |
| 0.6396875 | 49.91 |
| 0.6396990740740741 | 49.914 |
| 0.6397106481481482 | 49.921 |
| 0.6397222222222222 | 49.928 |
| 0.6397337962962962 | 49.935 |
| 0.6397453703703704 | 49.942 |
| 0.6397569444444444 | 49.949 |
| 0.6397685185185186 | 49.957 |
| 0.6397800925925926 | 49.962 |
| 0.6397916666666666 | 49.965 |
| 0.6398032407407407 | 49.97 |
| 0.6398148148148148 | 49.972 |
| 0.6398263888888889 | 49.975 |
| 0.639837962962963 | 49.976 |
| 0.6398495370370371 | 49.977 |
| 0.6398611111111111 | 49.974 |
| 0.6398726851851851 | 49.971 |
| 0.6398842592592593 | 49.968 |
| 0.6398958333333333 | 49.967 |
| 0.6399074074074074 | 49.963 |
| 0.6399189814814815 | 49.962 |
| 0.6399305555555556 | 49.963 |
| 0.6399421296296296 | 49.964 |
| 0.6399537037037036 | 49.962 |
| 0.6399652777777778 | 49.962 |
| 0.6399768518518518 | 49.962 |
| 0.639988425925926 | 49.962 |
| 0.64 | 49.962 |
| 0.640011574074074 | 49.964 |
| 0.6400231481481481 | 49.965 |
| 0.6400347222222222 | 49.963 |
| 0.6400462962962963 | 49.962 |
| 0.6400578703703704 | 49.954 |
| 0.6400694444444445 | 49.948 |
| 0.6400810185185185 | 49.944 |
| 0.6400925925925925 | 49.944 |
| 0.6401041666666667 | 49.942 |
| 0.6401157407407407 | 49.945 |
| 0.6401273148148149 | 49.943 |
| 0.6401388888888889 | 49.944 |
| 0.640150462962963 | 49.943 |
| 0.640162037037037 | 49.943 |
| 0.640173611111111 | 49.945 |
| 0.6401851851851852 | 49.945 |
| 0.6401967592592592 | 49.944 |
| 0.6402083333333334 | 49.943 |
| 0.6402199074074074 | 49.942 |
| 0.6402314814814815 | 49.944 |
| 0.6402430555555555 | 49.944 |
| 0.6402546296296296 | 49.947 |
| 0.6402662037037037 | 49.95 |
| 0.6402777777777778 | 49.954 |
| 0.6402893518518519 | 49.957 |
| 0.6403009259259259 | 49.958 |
| 0.6403125 | 49.959 |
| 0.6403240740740741 | 49.959 |
| 0.6403356481481481 | 49.961 |
| 0.6403472222222223 | 49.958 |
| 0.6403587962962963 | 49.955 |
| 0.6403703703703704 | 49.949 |
| 0.6403819444444444 | 49.941 |
| 0.6403935185185184 | 49.935 |
| 0.6404050925925926 | 49.934 |
| 0.6404166666666666 | 49.931 |
| 0.6404282407407408 | 49.926 |
| 0.6404398148148148 | 49.924 |
| 0.6404513888888889 | 49.921 |
| 0.6404629629629629 | 49.922 |
| 0.640474537037037 | 49.922 |
| 0.6404861111111111 | 49.923 |
| 0.6404976851851852 | 49.925 |
| 0.6405092592592593 | 49.928 |
| 0.6405208333333333 | 49.929 |
| 0.6405324074074074 | 49.927 |
| 0.6405439814814815 | 49.929 |
| 0.6405555555555555 | 49.931 |
| 0.6405671296296297 | 49.935 |
| 0.6405787037037037 | 49.939 |
| 0.6405902777777778 | 49.942 |
| 0.6406018518518518 | 49.946 |
| 0.640613425925926 | 49.949 |
| 0.640625 | 49.954 |
| 0.640636574074074 | 49.957 |
| 0.6406481481481482 | 49.961 |
| 0.6406597222222222 | 49.961 |
| 0.6406712962962963 | 49.961 |
| 0.6406828703703703 | 49.96 |
| 0.6406944444444445 | 49.96 |
| 0.6407060185185185 | 49.958 |
| 0.6407175925925926 | 49.957 |
| 0.6407291666666667 | 49.956 |
| 0.6407407407407407 | 49.955 |
| 0.6407523148148148 | 49.953 |
| 0.6407638888888889 | 49.951 |
| 0.640775462962963 | 49.952 |
| 0.6407870370370371 | 49.952 |
| 0.6407986111111111 | 49.953 |
| 0.6408101851851852 | 49.955 |
| 0.6408217592592592 | 49.957 |
| 0.6408333333333334 | 49.959 |
| 0.6408449074074074 | 49.96 |
| 0.6408564814814816 | 49.963 |
| 0.6408680555555556 | 49.965 |
| 0.6408796296296296 | 49.967 |
| 0.6408912037037037 | 49.969 |
| 0.6409027777777777 | 49.969 |
| 0.6409143518518519 | 49.971 |
| 0.6409259259259259 | 49.971 |
| 0.6409375 | 49.97 |
| 0.6409490740740741 | 49.967 |
| 0.6409606481481481 | 49.965 |
| 0.6409722222222222 | 49.962 |
| 0.6409837962962963 | 49.958 |
| 0.6409953703703704 | 49.955 |
| 0.6410069444444445 | 49.952 |
| 0.6410185185185185 | 49.949 |
| 0.6410300925925926 | 49.947 |
| 0.6410416666666666 | 49.945 |
| 0.6410532407407408 | 49.943 |
| 0.6410648148148148 | 49.941 |
| 0.641076388888889 | 49.941 |
| 0.641087962962963 | 49.942 |
| 0.641099537037037 | 49.944 |
| 0.6411111111111111 | 49.948 |
| 0.6411226851851851 | 49.953 |
| 0.6411342592592593 | 49.958 |
| 0.6411458333333333 | 49.962 |
| 0.6411574074074075 | 49.964 |
| 0.6411689814814815 | 49.964 |
| 0.6411805555555555 | 49.965 |
| 0.6411921296296296 | 49.964 |
| 0.6412037037037037 | 49.963 |
| 0.6412152777777778 | 49.96 |
| 0.6412268518518519 | 49.957 |
| 0.641238425925926 | 49.956 |
| 0.64125 | 49.954 |
| 0.641261574074074 | 49.955 |
| 0.6412731481481482 | 49.956 |
| 0.6412847222222222 | 49.958 |
| 0.6412962962962964 | 49.959 |
| 0.6413078703703704 | 49.959 |
| 0.6413194444444444 | 49.96 |
| 0.6413310185185185 | 49.963 |
| 0.6413425925925926 | 49.966 |
| 0.6413541666666667 | 49.965 |
| 0.6413657407407407 | 49.965 |
| 0.6413773148148149 | 49.961 |
| 0.6413888888888889 | 49.96 |
| 0.6414004629629629 | 49.959 |
| 0.641412037037037 | 49.962 |
| 0.6414236111111111 | 49.966 |
| 0.6414351851851852 | 49.969 |
| 0.6414467592592593 | 49.974 |
| 0.6414583333333334 | 49.978 |
| 0.6414699074074074 | 49.984 |
| 0.6414814814814814 | 49.987 |
| 0.6414930555555556 | 49.994 |
| 0.6415046296296296 | 49.996 |
| 0.6415162037037038 | 49.997 |
| 0.6415277777777778 | 49.997 |
| 0.6415393518518518 | 49.998 |
| 0.6415509259259259 | 49.996 |
| 0.6415625 | 49.996 |
| 0.6415740740740741 | 49.995 |
| 0.6415856481481481 | 49.993 |
| 0.6415972222222223 | 49.994 |
| 0.6416087962962963 | 49.997 |
| 0.6416203703703703 | 49.998 |
| 0.6416319444444444 | 49.999 |
| 0.6416435185185185 | 49.997 |
| 0.6416550925925926 | 49.997 |
| 0.6416666666666667 | 49.997 |
| 0.6416782407407408 | 49.994 |
| 0.6416898148148148 | 49.991 |
| 0.6417013888888888 | 49.987 |
| 0.641712962962963 | 49.983 |
| 0.641724537037037 | 49.981 |
| 0.6417361111111112 | 49.976 |
| 0.6417476851851852 | 49.972 |
| 0.6417592592592593 | 49.967 |
| 0.6417708333333333 | 49.963 |
| 0.6417824074074074 | 49.959 |
| 0.6417939814814815 | 49.958 |
| 0.6418055555555555 | 49.957 |
| 0.6418171296296297 | 49.956 |
| 0.6418287037037037 | 49.953 |
| 0.6418402777777777 | 49.954 |
| 0.6418518518518518 | 49.953 |
| 0.6418634259259259 | 49.952 |
| 0.641875 | 49.953 |
| 0.6418865740740741 | 49.952 |
| 0.6418981481481482 | 49.952 |
| 0.6419097222222222 | 49.953 |
| 0.6419212962962962 | 49.954 |
| 0.6419328703703704 | 49.956 |
| 0.6419444444444444 | 49.956 |
| 0.6419560185185186 | 49.958 |
| 0.6419675925925926 | 49.961 |
| 0.6419791666666667 | 49.962 |
| 0.6419907407407407 | 49.963 |
| 0.6420023148148148 | 49.966 |
| 0.6420138888888889 | 49.967 |
| 0.642025462962963 | 49.965 |
| 0.6420370370370371 | 49.965 |
| 0.6420486111111111 | 49.965 |
| 0.6420601851851852 | 49.964 |
| 0.6420717592592592 | 49.962 |
| 0.6420833333333333 | 49.961 |
| 0.6420949074074074 | 49.961 |
| 0.6421064814814815 | 49.965 |
| 0.6421180555555556 | 49.968 |
| 0.6421296296296296 | 49.972 |
| 0.6421412037037036 | 49.973 |
| 0.6421527777777778 | 49.975 |
| 0.6421643518518518 | 49.976 |
| 0.642175925925926 | 49.978 |
| 0.6421875 | 49.978 |
| 0.6421990740740741 | 49.982 |
| 0.6422106481481481 | 49.982 |
| 0.6422222222222222 | 49.985 |
| 0.6422337962962963 | 49.986 |
| 0.6422453703703704 | 49.985 |
| 0.6422569444444445 | 49.985 |
| 0.6422685185185185 | 49.988 |
| 0.6422800925925926 | 49.991 |
| 0.6422916666666666 | 49.996 |
| 0.6423032407407407 | 49.997 |
| 0.6423148148148148 | 50.001 |
| 0.6423263888888889 | 50.003 |
| 0.642337962962963 | 50.006 |
| 0.642349537037037 | 50.007 |
| 0.642361111111111 | 50.006 |
| 0.6423726851851852 | 50.003 |
| 0.6423842592592592 | 50 |
| 0.6423958333333334 | 50.001 |
| 0.6424074074074074 | 50.001 |
| 0.6424189814814815 | 49.996 |
| 0.6424305555555555 | 49.996 |
| 0.6424421296296297 | 49.995 |
| 0.6424537037037037 | 49.994 |
| 0.6424652777777778 | 49.995 |
| 0.6424768518518519 | 49.999 |
| 0.6424884259259259 | 50 |
| 0.6425 | 49.996 |
| 0.642511574074074 | 49.994 |
| 0.6425231481481481 | 49.991 |
| 0.6425347222222222 | 49.988 |
| 0.6425462962962963 | 49.987 |
| 0.6425578703703704 | 49.986 |
| 0.6425694444444444 | 49.989 |
| 0.6425810185185185 | 49.989 |
| 0.6425925925925926 | 49.99 |
| 0.6426041666666666 | 49.993 |
| 0.6426157407407408 | 49.994 |
| 0.6426273148148148 | 49.995 |
| 0.6426388888888889 | 49.992 |
| 0.6426504629629629 | 49.99 |
| 0.6426620370370371 | 49.988 |
| 0.6426736111111111 | 49.985 |
| 0.6426851851851852 | 49.983 |
| 0.6426967592592593 | 49.98 |
| 0.6427083333333333 | 49.978 |
| 0.6427199074074074 | 49.977 |
| 0.6427314814814815 | 49.975 |
| 0.6427430555555556 | 49.976 |
| 0.6427546296296297 | 49.981 |
| 0.6427662037037037 | 49.984 |
| 0.6427777777777778 | 49.989 |
| 0.6427893518518518 | 49.991 |
| 0.6428009259259259 | 49.992 |
| 0.6428125 | 49.993 |
| 0.642824074074074 | 49.993 |
| 0.6428356481481482 | 49.991 |
| 0.6428472222222222 | 49.99 |
| 0.6428587962962963 | 49.99 |
| 0.6428703703703703 | 49.992 |
| 0.6428819444444445 | 49.99 |
| 0.6428935185185185 | 49.991 |
| 0.6429050925925927 | 49.991 |
| 0.6429166666666667 | 49.99 |
| 0.6429282407407407 | 49.99 |
| 0.6429398148148148 | 49.991 |
| 0.6429513888888889 | 49.993 |
| 0.642962962962963 | 49.992 |
| 0.6429745370370371 | 49.992 |
| 0.6429861111111111 | 49.993 |
| 0.6429976851851852 | 49.994 |
| 0.6430092592592592 | 49.993 |
| 0.6430208333333333 | 49.999 |
| 0.6430324074074074 | 50.002 |
| 0.6430439814814815 | 50.005 |